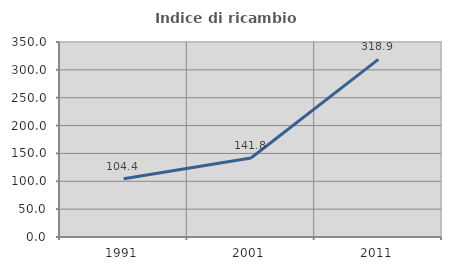
| Category | Indice di ricambio occupazionale  |
|---|---|
| 1991.0 | 104.444 |
| 2001.0 | 141.83 |
| 2011.0 | 318.889 |